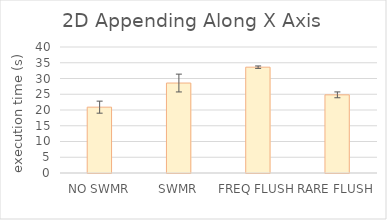
| Category | 2D Appending in X |
|---|---|
| NO SWMR | 20.9 |
| SWMR | 28.559 |
| FREQ FLUSH | 33.593 |
| RARE FLUSH | 24.813 |